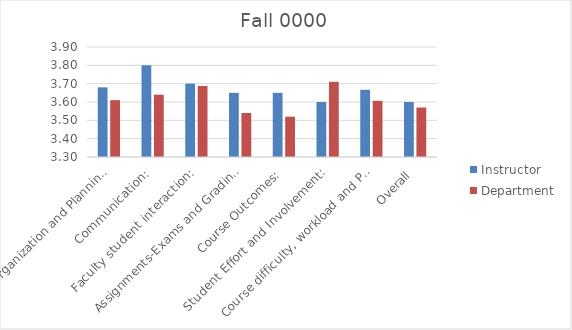
| Category | Instructor | Department |
|---|---|---|
| Course Organization and Planning: | 3.68 | 3.61 |
| Communication: | 3.8 | 3.64 |
| Faculty student interaction: | 3.7 | 3.688 |
| Assignments-Exams and Grading: | 3.65 | 3.54 |
| Course Outcomes: | 3.65 | 3.52 |
| Student Effort and Involvement: | 3.6 | 3.71 |
| Course difficulty, workload and Pace: | 3.667 | 3.607 |
| Overall | 3.6 | 3.57 |